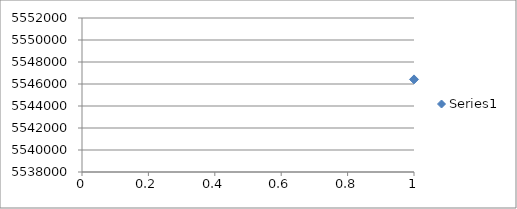
| Category | Series 0 |
|---|---|
| 0 | 5546417.914 |
| 1 | 5543534.02 |
| 2 | 5548026.35 |
| 3 | 5543861.525 |
| 4 | 5540202.489 |
| 5 | 5547605.602 |
| 6 | 5543132.239 |
| 7 | 5540457.572 |
| 8 | 5540534.109 |
| 9 | 5549050.925 |
| 10 | 5542721.905 |
| 11 | 5543575.974 |
| 12 | 5541684.33 |
| 13 | 5549126.831 |
| 14 | 5548494.223 |
| 15 | 5542628.431 |
| 16 | 5546273.979 |
| 17 | 5548164.811 |
| 18 | 5543080.792 |
| 19 | 5549540.377 |
| 20 | 5548133.203 |
| 21 | 5549189.139 |
| 22 | 5543487.129 |
| 23 | 5540738.648 |
| 24 | 5549845.822 |
| 25 | 5545018.881 |
| 26 | 5540665.995 |
| 27 | 5545222.266 |
| 28 | 5543676.125 |
| 29 | 5547753.111 |
| 30 | 5540866.269 |
| 31 | 5543859.481 |
| 32 | 5548949.627 |
| 33 | 5543294.505 |
| 34 | 5540035.096 |
| 35 | 5544616.038 |
| 36 | 5545341.049 |
| 37 | 5540253.9 |
| 38 | 5544759.459 |
| 39 | 5544749.704 |
| 40 | 5541585.905 |
| 41 | 5544867.867 |
| 42 | 5548925.848 |
| 43 | 5540728.075 |
| 44 | 5541805.885 |
| 45 | 5546589.515 |
| 46 | 5545286.752 |
| 47 | 5544847.996 |
| 48 | 5543605.789 |
| 49 | 5548792.379 |
| 50 | 5543345.354 |
| 51 | 5544694.684 |
| 52 | 5547616.65 |
| 53 | 5540707.935 |
| 54 | 5545388.961 |
| 55 | 5541653.356 |
| 56 | 5549921.902 |
| 57 | 5548952.396 |
| 58 | 5545199.558 |
| 59 | 5540341.033 |
| 60 | 5543396.428 |
| 61 | 5548480.327 |
| 62 | 5541880.409 |
| 63 | 5540754.941 |
| 64 | 5544336.433 |
| 65 | 5546922.865 |
| 66 | 5548265.565 |
| 67 | 5549267.014 |
| 68 | 5549480.764 |
| 69 | 5544074.425 |
| 70 | 5544321.669 |
| 71 | 5548030.874 |
| 72 | 5544462.988 |
| 73 | 5540123.491 |
| 74 | 5543184.104 |
| 75 | 5541860.555 |
| 76 | 5542672.006 |
| 77 | 5549488.128 |
| 78 | 5540247.147 |
| 79 | 5545254.105 |
| 80 | 5540308.946 |
| 81 | 5545787.425 |
| 82 | 5549310.998 |
| 83 | 5548542.998 |
| 84 | 5540559.091 |
| 85 | 5548562 |
| 86 | 5545558.321 |
| 87 | 5540903.439 |
| 88 | 5547011.521 |
| 89 | 5544424.815 |
| 90 | 5544590.576 |
| 91 | 5544552.029 |
| 92 | 5545312.904 |
| 93 | 5543523.279 |
| 94 | 5541653.788 |
| 95 | 5540463.416 |
| 96 | 5540504.353 |
| 97 | 5549107.264 |
| 98 | 5549828.301 |
| 99 | 5540143.419 |
| 100 | 5545079.543 |
| 101 | 5541960.333 |
| 102 | 5544156.133 |
| 103 | 5541781 |
| 104 | 5540326.228 |
| 105 | 5542153.191 |
| 106 | 5545267.187 |
| 107 | 5540563.461 |
| 108 | 5547825.21 |
| 109 | 5548086.303 |
| 110 | 5548335.024 |
| 111 | 5545075.141 |
| 112 | 5540107.827 |
| 113 | 5540339.965 |
| 114 | 5549440.197 |
| 115 | 5545555.484 |
| 116 | 5543345.076 |
| 117 | 5549652.201 |
| 118 | 5549284.903 |
| 119 | 5546656.549 |
| 120 | 5541411.57 |
| 121 | 5541369.815 |
| 122 | 5540378.856 |
| 123 | 5545005.455 |
| 124 | 5546200.662 |
| 125 | 5548407.434 |
| 126 | 5542985.658 |
| 127 | 5546422.147 |
| 128 | 5541824.942 |
| 129 | 5543633.84 |
| 130 | 5546415.919 |
| 131 | 5549853.438 |
| 132 | 5545623.485 |
| 133 | 5547807.955 |
| 134 | 5540109.489 |
| 135 | 5547678.098 |
| 136 | 5540040.387 |
| 137 | 5549320.554 |
| 138 | 5545318.539 |
| 139 | 5541054.969 |
| 140 | 5540901.717 |
| 141 | 5549842.477 |
| 142 | 5543679.347 |
| 143 | 5548168.565 |
| 144 | 5541177.513 |
| 145 | 5547025.653 |
| 146 | 5541871.165 |
| 147 | 5541194.628 |
| 148 | 5546904.781 |
| 149 | 5548498.92 |
| 150 | 5549205.154 |
| 151 | 5541067.312 |
| 152 | 5547108.293 |
| 153 | 5547088.39 |
| 154 | 5548741.76 |
| 155 | 5542240.513 |
| 156 | 5548148.908 |
| 157 | 5548879.094 |
| 158 | 5543430.575 |
| 159 | 5541896.605 |
| 160 | 5545031.396 |
| 161 | 5540424.955 |
| 162 | 5541260.764 |
| 163 | 5548387.714 |
| 164 | 5549491.853 |
| 165 | 5543285.558 |
| 166 | 5545613.376 |
| 167 | 5542824.66 |
| 168 | 5543358.362 |
| 169 | 5544142.527 |
| 170 | 5542336.578 |
| 171 | 5541545.977 |
| 172 | 5548901.123 |
| 173 | 5546501.768 |
| 174 | 5541070.911 |
| 175 | 5545782.882 |
| 176 | 5540385.152 |
| 177 | 5542673.974 |
| 178 | 5540886.111 |
| 179 | 5548119.379 |
| 180 | 5549668.828 |
| 181 | 5549241.794 |
| 182 | 5549033.547 |
| 183 | 5540189.108 |
| 184 | 5549755.329 |
| 185 | 5546545.365 |
| 186 | 5540048.696 |
| 187 | 5540974.43 |
| 188 | 5541884.939 |
| 189 | 5545665.523 |
| 190 | 5544699.491 |
| 191 | 5547536.855 |
| 192 | 5542160.923 |
| 193 | 5542667.532 |
| 194 | 5541490.646 |
| 195 | 5546055.605 |
| 196 | 5546951.194 |
| 197 | 5545202.673 |
| 198 | 5548186.544 |
| 199 | 5546739.688 |
| 200 | 5542864.86 |
| 201 | 5544371.456 |
| 202 | 5546592.963 |
| 203 | 5543575.929 |
| 204 | 5546273.757 |
| 205 | 5542100.957 |
| 206 | 5548449.779 |
| 207 | 5543361.122 |
| 208 | 5548191.517 |
| 209 | 5545421.636 |
| 210 | 5543820.395 |
| 211 | 5545851.975 |
| 212 | 5546249.813 |
| 213 | 5542926.361 |
| 214 | 5548259.516 |
| 215 | 5549872.77 |
| 216 | 5546198.466 |
| 217 | 5540802.364 |
| 218 | 5541529.737 |
| 219 | 5545003.202 |
| 220 | 5545915.246 |
| 221 | 5542356.575 |
| 222 | 5545076.432 |
| 223 | 5540335.933 |
| 224 | 5541410.207 |
| 225 | 5542746.784 |
| 226 | 5544722.02 |
| 227 | 5545859.975 |
| 228 | 5540880.23 |
| 229 | 5544577.048 |
| 230 | 5542743.396 |
| 231 | 5543671.598 |
| 232 | 5548449.502 |
| 233 | 5543637.23 |
| 234 | 5541589.319 |
| 235 | 5544035.238 |
| 236 | 5545214.875 |
| 237 | 5541484.275 |
| 238 | 5543743.68 |
| 239 | 5543140.087 |
| 240 | 5543052.927 |
| 241 | 5547972.827 |
| 242 | 5542769.186 |
| 243 | 5545919.376 |
| 244 | 5548488.76 |
| 245 | 5544092.982 |
| 246 | 5549180.142 |
| 247 | 5545568.081 |
| 248 | 5549627.914 |
| 249 | 5549446.691 |
| 250 | 5543011.801 |
| 251 | 5544553.663 |
| 252 | 5543523.394 |
| 253 | 5544477.552 |
| 254 | 5540487.39 |
| 255 | 5546370.913 |
| 256 | 5544407.495 |
| 257 | 5549747.028 |
| 258 | 5544987.629 |
| 259 | 5548264.354 |
| 260 | 5548868.503 |
| 261 | 5541222.243 |
| 262 | 5544632.959 |
| 263 | 5545602.851 |
| 264 | 5545051.519 |
| 265 | 5545198.845 |
| 266 | 5549734.058 |
| 267 | 5548798.076 |
| 268 | 5549756.347 |
| 269 | 5542916.82 |
| 270 | 5549538.334 |
| 271 | 5540540.054 |
| 272 | 5547676.758 |
| 273 | 5541219.159 |
| 274 | 5546282.506 |
| 275 | 5540253.399 |
| 276 | 5549215.893 |
| 277 | 5543826.774 |
| 278 | 5541517.648 |
| 279 | 5546430.177 |
| 280 | 5549604.256 |
| 281 | 5545135.997 |
| 282 | 5548990.333 |
| 283 | 5540703.298 |
| 284 | 5542906.039 |
| 285 | 5541139.735 |
| 286 | 5549553.656 |
| 287 | 5548104.446 |
| 288 | 5549377.028 |
| 289 | 5540453.146 |
| 290 | 5541202.437 |
| 291 | 5545373.708 |
| 292 | 5546130.148 |
| 293 | 5544885.854 |
| 294 | 5545265.283 |
| 295 | 5546459.552 |
| 296 | 5540472.91 |
| 297 | 5546012.17 |
| 298 | 5546390.407 |
| 299 | 5542305.143 |
| 300 | 5549941.088 |
| 301 | 5547652.168 |
| 302 | 5543833.838 |
| 303 | 5546159.668 |
| 304 | 5548578.874 |
| 305 | 5543069.296 |
| 306 | 5546564.175 |
| 307 | 5540566.011 |
| 308 | 5543277.164 |
| 309 | 5544760.841 |
| 310 | 5547064.375 |
| 311 | 5541571.628 |
| 312 | 5544666.04 |
| 313 | 5547752.93 |
| 314 | 5542440.839 |
| 315 | 5549888.163 |
| 316 | 5545346.359 |
| 317 | 5546031.728 |
| 318 | 5545412.865 |
| 319 | 5544061.656 |
| 320 | 5544691.268 |
| 321 | 5540171.685 |
| 322 | 5541110.828 |
| 323 | 5549901.558 |
| 324 | 5545623.603 |
| 325 | 5541479.261 |
| 326 | 5546368.363 |
| 327 | 5540489.281 |
| 328 | 5547460.589 |
| 329 | 5547634.328 |
| 330 | 5548435.054 |
| 331 | 5546142.933 |
| 332 | 5545976.139 |
| 333 | 5548243.425 |
| 334 | 5545320.335 |
| 335 | 5544489.93 |
| 336 | 5549493.951 |
| 337 | 5546403.805 |
| 338 | 5542187.146 |
| 339 | 5544354.353 |
| 340 | 5545331.316 |
| 341 | 5546833.034 |
| 342 | 5546735.348 |
| 343 | 5548087.412 |
| 344 | 5542588.672 |
| 345 | 5546821.776 |
| 346 | 5548764.534 |
| 347 | 5549234.343 |
| 348 | 5545905.822 |
| 349 | 5544537.26 |
| 350 | 5546664.169 |
| 351 | 5545210.606 |
| 352 | 5549448.195 |
| 353 | 5547864.599 |
| 354 | 5545795.639 |
| 355 | 5549760.145 |
| 356 | 5543069.043 |
| 357 | 5543066.195 |
| 358 | 5547663.955 |
| 359 | 5541383.737 |
| 360 | 5549127.552 |
| 361 | 5546403.304 |
| 362 | 5540032.499 |
| 363 | 5548706.008 |
| 364 | 5543264.449 |
| 365 | 5542919.034 |
| 366 | 5545255.008 |
| 367 | 5545288.876 |
| 368 | 5549939.887 |
| 369 | 5545361.076 |
| 370 | 5546801.478 |
| 371 | 5542137.104 |
| 372 | 5545844.189 |
| 373 | 5547780.403 |
| 374 | 5540783.833 |
| 375 | 5546397.652 |
| 376 | 5545633.211 |
| 377 | 5548045.695 |
| 378 | 5548054.476 |
| 379 | 5544329.248 |
| 380 | 5542161.357 |
| 381 | 5540686.287 |
| 382 | 5541916.95 |
| 383 | 5547927.888 |
| 384 | 5540455.16 |
| 385 | 5540726.84 |
| 386 | 5541951.215 |
| 387 | 5549449.551 |
| 388 | 5544986.019 |
| 389 | 5549943.332 |
| 390 | 5547110.929 |
| 391 | 5543588.025 |
| 392 | 5549727.133 |
| 393 | 5540388.674 |
| 394 | 5549944.257 |
| 395 | 5549892.559 |
| 396 | 5540528.449 |
| 397 | 5540354.094 |
| 398 | 5548793.29 |
| 399 | 5543267.192 |
| 400 | 5547357.327 |
| 401 | 5544582.159 |
| 402 | 5542833.766 |
| 403 | 5540269.496 |
| 404 | 5545299.683 |
| 405 | 5547391.504 |
| 406 | 5549272.217 |
| 407 | 5548033.003 |
| 408 | 5549118.966 |
| 409 | 5549609.639 |
| 410 | 5543441.186 |
| 411 | 5547517.867 |
| 412 | 5546014.517 |
| 413 | 5543935.601 |
| 414 | 5545264.913 |
| 415 | 5540354.565 |
| 416 | 5542223.468 |
| 417 | 5547452.188 |
| 418 | 5541357.422 |
| 419 | 5546907.432 |
| 420 | 5542791.597 |
| 421 | 5546768.611 |
| 422 | 5541456.55 |
| 423 | 5545444.737 |
| 424 | 5547531.524 |
| 425 | 5544644.597 |
| 426 | 5542026.79 |
| 427 | 5546547.733 |
| 428 | 5549367.961 |
| 429 | 5541836.801 |
| 430 | 5547781.884 |
| 431 | 5542500.012 |
| 432 | 5541647.102 |
| 433 | 5549498.215 |
| 434 | 5546116.896 |
| 435 | 5544150.404 |
| 436 | 5548800.349 |
| 437 | 5545984.738 |
| 438 | 5548597.966 |
| 439 | 5546132.644 |
| 440 | 5549335.863 |
| 441 | 5542386.725 |
| 442 | 5549422.94 |
| 443 | 5548718.837 |
| 444 | 5544642.026 |
| 445 | 5541409.654 |
| 446 | 5547239.605 |
| 447 | 5541373.715 |
| 448 | 5540335.593 |
| 449 | 5543182.385 |
| 450 | 5549215.67 |
| 451 | 5549889.59 |
| 452 | 5541721.934 |
| 453 | 5542653.149 |
| 454 | 5545188.949 |
| 455 | 5547737.058 |
| 456 | 5540279.345 |
| 457 | 5541030.187 |
| 458 | 5544724.888 |
| 459 | 5542297.418 |
| 460 | 5544180.092 |
| 461 | 5541692.98 |
| 462 | 5549166.81 |
| 463 | 5548197.657 |
| 464 | 5542954.515 |
| 465 | 5544656.066 |
| 466 | 5544454.834 |
| 467 | 5545692.561 |
| 468 | 5545657.345 |
| 469 | 5540703.733 |
| 470 | 5548214.963 |
| 471 | 5549816.212 |
| 472 | 5541246.404 |
| 473 | 5545566.784 |
| 474 | 5548344.319 |
| 475 | 5545973.803 |
| 476 | 5547662.698 |
| 477 | 5549615.46 |
| 478 | 5545780.238 |
| 479 | 5548607.235 |
| 480 | 5545157.064 |
| 481 | 5540994.252 |
| 482 | 5548666.65 |
| 483 | 5547469.628 |
| 484 | 5548169.463 |
| 485 | 5544727.535 |
| 486 | 5544912.852 |
| 487 | 5541396.664 |
| 488 | 5540644.151 |
| 489 | 5547791.987 |
| 490 | 5542004.32 |
| 491 | 5544248.912 |
| 492 | 5546720.845 |
| 493 | 5541071.505 |
| 494 | 5545185.183 |
| 495 | 5546777.146 |
| 496 | 5542476.2 |
| 497 | 5546214.809 |
| 498 | 5547930.88 |
| 499 | 5547868.377 |
| 500 | 5544901.385 |
| 501 | 5543386.943 |
| 502 | 5548262.867 |
| 503 | 5544982.527 |
| 504 | 5543773.843 |
| 505 | 5541793.039 |
| 506 | 5547794.544 |
| 507 | 5547878.966 |
| 508 | 5548579.776 |
| 509 | 5541330.998 |
| 510 | 5541481.13 |
| 511 | 5545907.93 |
| 512 | 5540012.833 |
| 513 | 5540224.905 |
| 514 | 5542279.049 |
| 515 | 5540144.887 |
| 516 | 5543218.098 |
| 517 | 5541972.271 |
| 518 | 5546320.931 |
| 519 | 5547388.596 |
| 520 | 5549500.987 |
| 521 | 5541930.981 |
| 522 | 5540862.496 |
| 523 | 5549603.985 |
| 524 | 5542671.274 |
| 525 | 5541689.134 |
| 526 | 5547132.146 |
| 527 | 5544323.207 |
| 528 | 5544355.856 |
| 529 | 5545907.933 |
| 530 | 5542945.183 |
| 531 | 5540323.299 |
| 532 | 5543677.157 |
| 533 | 5540125.2 |
| 534 | 5541514.245 |
| 535 | 5549253.342 |
| 536 | 5549411.009 |
| 537 | 5546676.547 |
| 538 | 5542427.179 |
| 539 | 5546523.989 |
| 540 | 5542783.647 |
| 541 | 5544943.387 |
| 542 | 5541483.241 |
| 543 | 5544397.248 |
| 544 | 5545902.192 |
| 545 | 5544484.489 |
| 546 | 5546513.066 |
| 547 | 5542743.528 |
| 548 | 5545941.77 |
| 549 | 5549707.684 |
| 550 | 5543428.842 |
| 551 | 5546759.111 |
| 552 | 5543464.424 |
| 553 | 5540408.404 |
| 554 | 5546512.638 |
| 555 | 5540816.138 |
| 556 | 5546086.047 |
| 557 | 5543550.076 |
| 558 | 5543366.301 |
| 559 | 5546380.564 |
| 560 | 5549268.57 |
| 561 | 5542126.559 |
| 562 | 5549918.08 |
| 563 | 5540215.504 |
| 564 | 5544110.841 |
| 565 | 5544482.057 |
| 566 | 5548898.502 |
| 567 | 5545109.542 |
| 568 | 5547546.437 |
| 569 | 5549461.608 |
| 570 | 5542602.436 |
| 571 | 5549133.076 |
| 572 | 5540082.828 |
| 573 | 5549828.132 |
| 574 | 5547007.588 |
| 575 | 5544390.453 |
| 576 | 5544740.627 |
| 577 | 5543910.544 |
| 578 | 5545702.883 |
| 579 | 5547759.81 |
| 580 | 5549976.569 |
| 581 | 5542577.29 |
| 582 | 5540565.447 |
| 583 | 5545218.358 |
| 584 | 5540483.897 |
| 585 | 5540828.563 |
| 586 | 5541958.019 |
| 587 | 5547293.089 |
| 588 | 5549728.681 |
| 589 | 5545423.688 |
| 590 | 5540448.34 |
| 591 | 5547097.023 |
| 592 | 5548689.784 |
| 593 | 5542443.257 |
| 594 | 5540293.641 |
| 595 | 5540408.185 |
| 596 | 5548337.586 |
| 597 | 5549039.295 |
| 598 | 5540618.188 |
| 599 | 5546219.125 |
| 600 | 5542272.669 |
| 601 | 5544726.867 |
| 602 | 5543785.727 |
| 603 | 5545653.39 |
| 604 | 5545691.582 |
| 605 | 5549284.569 |
| 606 | 5543844.779 |
| 607 | 5540645.563 |
| 608 | 5542742.021 |
| 609 | 5546143.456 |
| 610 | 5548548.555 |
| 611 | 5547273.209 |
| 612 | 5547564.616 |
| 613 | 5548897.891 |
| 614 | 5547273.22 |
| 615 | 5541567.478 |
| 616 | 5542493.629 |
| 617 | 5547682.355 |
| 618 | 5548981.54 |
| 619 | 5544812.144 |
| 620 | 5541906.477 |
| 621 | 5548032.368 |
| 622 | 5547450.967 |
| 623 | 5545674.494 |
| 624 | 5548106.382 |
| 625 | 5540416.762 |
| 626 | 5541982.488 |
| 627 | 5545534.065 |
| 628 | 5549027.322 |
| 629 | 5542129.425 |
| 630 | 5547235.084 |
| 631 | 5549922.781 |
| 632 | 5541272.85 |
| 633 | 5544884.66 |
| 634 | 5549780.546 |
| 635 | 5544433.52 |
| 636 | 5544834.41 |
| 637 | 5546209.344 |
| 638 | 5547002.978 |
| 639 | 5549049.946 |
| 640 | 5549677.918 |
| 641 | 5540799.693 |
| 642 | 5543573.198 |
| 643 | 5547257.787 |
| 644 | 5540451.333 |
| 645 | 5543231.514 |
| 646 | 5547551.052 |
| 647 | 5540974.512 |
| 648 | 5542976.748 |
| 649 | 5541886.399 |
| 650 | 5546056.916 |
| 651 | 5545957.522 |
| 652 | 5542855.535 |
| 653 | 5548622.622 |
| 654 | 5548441.695 |
| 655 | 5543558.916 |
| 656 | 5544164.083 |
| 657 | 5544469.337 |
| 658 | 5541972.416 |
| 659 | 5546099.649 |
| 660 | 5543422.473 |
| 661 | 5541955.333 |
| 662 | 5547510.566 |
| 663 | 5541427.818 |
| 664 | 5547779.715 |
| 665 | 5548614.153 |
| 666 | 5542066.69 |
| 667 | 5543939.399 |
| 668 | 5548986.123 |
| 669 | 5549093.987 |
| 670 | 5545850.499 |
| 671 | 5543179.987 |
| 672 | 5541849.114 |
| 673 | 5543809.066 |
| 674 | 5547895.642 |
| 675 | 5549484.782 |
| 676 | 5545666.451 |
| 677 | 5547619.023 |
| 678 | 5547648.998 |
| 679 | 5543916.133 |
| 680 | 5548511.945 |
| 681 | 5543273.378 |
| 682 | 5546658.026 |
| 683 | 5542947.153 |
| 684 | 5543318.923 |
| 685 | 5540842.321 |
| 686 | 5549690.79 |
| 687 | 5543143.971 |
| 688 | 5545986.205 |
| 689 | 5549629.149 |
| 690 | 5546209.855 |
| 691 | 5545675.824 |
| 692 | 5540369.492 |
| 693 | 5549028.113 |
| 694 | 5549581.665 |
| 695 | 5548348.655 |
| 696 | 5546061.59 |
| 697 | 5546007.612 |
| 698 | 5540445.917 |
| 699 | 5541521.472 |
| 700 | 5543914.699 |
| 701 | 5541749.364 |
| 702 | 5549008.125 |
| 703 | 5541824.407 |
| 704 | 5549860.24 |
| 705 | 5543946.543 |
| 706 | 5548851.341 |
| 707 | 5546984.349 |
| 708 | 5543559.372 |
| 709 | 5545563.481 |
| 710 | 5549494.683 |
| 711 | 5546124.401 |
| 712 | 5545672.992 |
| 713 | 5540127.762 |
| 714 | 5546035.786 |
| 715 | 5546944.29 |
| 716 | 5546123.854 |
| 717 | 5547487.381 |
| 718 | 5543785.904 |
| 719 | 5540199.023 |
| 720 | 5543177.907 |
| 721 | 5544908.782 |
| 722 | 5540726.454 |
| 723 | 5546974.864 |
| 724 | 5544340.664 |
| 725 | 5549199.182 |
| 726 | 5543701.762 |
| 727 | 5546034.93 |
| 728 | 5541835.571 |
| 729 | 5542476.311 |
| 730 | 5546320.222 |
| 731 | 5544429.572 |
| 732 | 5540257.078 |
| 733 | 5542745.55 |
| 734 | 5549919.988 |
| 735 | 5540907.77 |
| 736 | 5544299.295 |
| 737 | 5548133.137 |
| 738 | 5544973.631 |
| 739 | 5541581.196 |
| 740 | 5548649.099 |
| 741 | 5547769.482 |
| 742 | 5543420.227 |
| 743 | 5541200.935 |
| 744 | 5541239.908 |
| 745 | 5541208.969 |
| 746 | 5547934.259 |
| 747 | 5543797.673 |
| 748 | 5548707.8 |
| 749 | 5540126.535 |
| 750 | 5547558.431 |
| 751 | 5544923.475 |
| 752 | 5544498.887 |
| 753 | 5543418.559 |
| 754 | 5540563.568 |
| 755 | 5545963.894 |
| 756 | 5541024.351 |
| 757 | 5545898.297 |
| 758 | 5543998.174 |
| 759 | 5546477.706 |
| 760 | 5549926.662 |
| 761 | 5546297.579 |
| 762 | 5543755 |
| 763 | 5548103.871 |
| 764 | 5549264.705 |
| 765 | 5547983.156 |
| 766 | 5543084.382 |
| 767 | 5542819.497 |
| 768 | 5542041.274 |
| 769 | 5545486.519 |
| 770 | 5542365.409 |
| 771 | 5546431.425 |
| 772 | 5543354.692 |
| 773 | 5548173.861 |
| 774 | 5546909.939 |
| 775 | 5548532.919 |
| 776 | 5548239.962 |
| 777 | 5543446.761 |
| 778 | 5540328.827 |
| 779 | 5549377.148 |
| 780 | 5549240.227 |
| 781 | 5547152.053 |
| 782 | 5543236.293 |
| 783 | 5542896.737 |
| 784 | 5546515.81 |
| 785 | 5548687.815 |
| 786 | 5541149.779 |
| 787 | 5544141.794 |
| 788 | 5543749.986 |
| 789 | 5540413.482 |
| 790 | 5540460.85 |
| 791 | 5545353.864 |
| 792 | 5540299.619 |
| 793 | 5547056.704 |
| 794 | 5542026.017 |
| 795 | 5546823.653 |
| 796 | 5540969.299 |
| 797 | 5542764.015 |
| 798 | 5549762.644 |
| 799 | 5544592.367 |
| 800 | 5545046.201 |
| 801 | 5546335.02 |
| 802 | 5547174.098 |
| 803 | 5543938.972 |
| 804 | 5547910.713 |
| 805 | 5549678.223 |
| 806 | 5547181.882 |
| 807 | 5540966.434 |
| 808 | 5546585.501 |
| 809 | 5543368.06 |
| 810 | 5545124.041 |
| 811 | 5549271.988 |
| 812 | 5542244.077 |
| 813 | 5547461.58 |
| 814 | 5547889.56 |
| 815 | 5547428.828 |
| 816 | 5544566.358 |
| 817 | 5549738.49 |
| 818 | 5548660.936 |
| 819 | 5548668.906 |
| 820 | 5545554.753 |
| 821 | 5549578.587 |
| 822 | 5541818.388 |
| 823 | 5548797.481 |
| 824 | 5542370.109 |
| 825 | 5547206.685 |
| 826 | 5540177.01 |
| 827 | 5542199.698 |
| 828 | 5545347.734 |
| 829 | 5541560.478 |
| 830 | 5541319.91 |
| 831 | 5548500.032 |
| 832 | 5545206.951 |
| 833 | 5548320.526 |
| 834 | 5549246.265 |
| 835 | 5546818.719 |
| 836 | 5543099.545 |
| 837 | 5548844.699 |
| 838 | 5544723.896 |
| 839 | 5543910.884 |
| 840 | 5544170.475 |
| 841 | 5543041.666 |
| 842 | 5541824.449 |
| 843 | 5544785.681 |
| 844 | 5544403.936 |
| 845 | 5544830.798 |
| 846 | 5546951.128 |
| 847 | 5541383.509 |
| 848 | 5549657.573 |
| 849 | 5540878.715 |
| 850 | 5541505.184 |
| 851 | 5541813.201 |
| 852 | 5540810.033 |
| 853 | 5546960.224 |
| 854 | 5545452.429 |
| 855 | 5547156.299 |
| 856 | 5547398.121 |
| 857 | 5547140.776 |
| 858 | 5545751.706 |
| 859 | 5546649.985 |
| 860 | 5548651.48 |
| 861 | 5540249.921 |
| 862 | 5544263.471 |
| 863 | 5545651.001 |
| 864 | 5541723.983 |
| 865 | 5540353.144 |
| 866 | 5548034.448 |
| 867 | 5549383.654 |
| 868 | 5549641.95 |
| 869 | 5541959.598 |
| 870 | 5543917.623 |
| 871 | 5546832.053 |
| 872 | 5549668.427 |
| 873 | 5542814.839 |
| 874 | 5547298.046 |
| 875 | 5547672.613 |
| 876 | 5542899.397 |
| 877 | 5549821.021 |
| 878 | 5540920.658 |
| 879 | 5545263.741 |
| 880 | 5543173.269 |
| 881 | 5542120.652 |
| 882 | 5544813.963 |
| 883 | 5547160.032 |
| 884 | 5549438.583 |
| 885 | 5542765.479 |
| 886 | 5548678.74 |
| 887 | 5547564.17 |
| 888 | 5544602.775 |
| 889 | 5544152.171 |
| 890 | 5540056.289 |
| 891 | 5542358.545 |
| 892 | 5549300.124 |
| 893 | 5540766.882 |
| 894 | 5544977.49 |
| 895 | 5541304.557 |
| 896 | 5543069.068 |
| 897 | 5546959.744 |
| 898 | 5549234.027 |
| 899 | 5547120.856 |
| 900 | 5547908.347 |
| 901 | 5547219.129 |
| 902 | 5546458.083 |
| 903 | 5544462.097 |
| 904 | 5549706.651 |
| 905 | 5548718.614 |
| 906 | 5547602.153 |
| 907 | 5541232.303 |
| 908 | 5541283.266 |
| 909 | 5541186.305 |
| 910 | 5547342.15 |
| 911 | 5546063.479 |
| 912 | 5541675.096 |
| 913 | 5546745.422 |
| 914 | 5546378.974 |
| 915 | 5540782.172 |
| 916 | 5540248.462 |
| 917 | 5544397.345 |
| 918 | 5543270.342 |
| 919 | 5542837.709 |
| 920 | 5540296.31 |
| 921 | 5542252.416 |
| 922 | 5543036.729 |
| 923 | 5548850.882 |
| 924 | 5546724.71 |
| 925 | 5547915.297 |
| 926 | 5544033.268 |
| 927 | 5543263.972 |
| 928 | 5548792.282 |
| 929 | 5546533.191 |
| 930 | 5548261.376 |
| 931 | 5540193.538 |
| 932 | 5544888.825 |
| 933 | 5546885.943 |
| 934 | 5547616.361 |
| 935 | 5542214.469 |
| 936 | 5548797.541 |
| 937 | 5540296.874 |
| 938 | 5548432.786 |
| 939 | 5546956.554 |
| 940 | 5549366.935 |
| 941 | 5546331.112 |
| 942 | 5548377.711 |
| 943 | 5542789.366 |
| 944 | 5545268.254 |
| 945 | 5547418.99 |
| 946 | 5547037.624 |
| 947 | 5544637.59 |
| 948 | 5543112.575 |
| 949 | 5549352.363 |
| 950 | 5541315.172 |
| 951 | 5548018.527 |
| 952 | 5543264.337 |
| 953 | 5542167.11 |
| 954 | 5548360.99 |
| 955 | 5543091.789 |
| 956 | 5546631.847 |
| 957 | 5548018.293 |
| 958 | 5547427.362 |
| 959 | 5545355.817 |
| 960 | 5540569.306 |
| 961 | 5540229.246 |
| 962 | 5548161.213 |
| 963 | 5544623.571 |
| 964 | 5544692.905 |
| 965 | 5548827.141 |
| 966 | 5540612.045 |
| 967 | 5543864.607 |
| 968 | 5544092.847 |
| 969 | 5540807.311 |
| 970 | 5545465.578 |
| 971 | 5548592.963 |
| 972 | 5541950.455 |
| 973 | 5542760.767 |
| 974 | 5542660.699 |
| 975 | 5548093.194 |
| 976 | 5549458.091 |
| 977 | 5545987.819 |
| 978 | 5546545.974 |
| 979 | 5545797.884 |
| 980 | 5540636.863 |
| 981 | 5545335.612 |
| 982 | 5547078.114 |
| 983 | 5545719.149 |
| 984 | 5548630.239 |
| 985 | 5545570.953 |